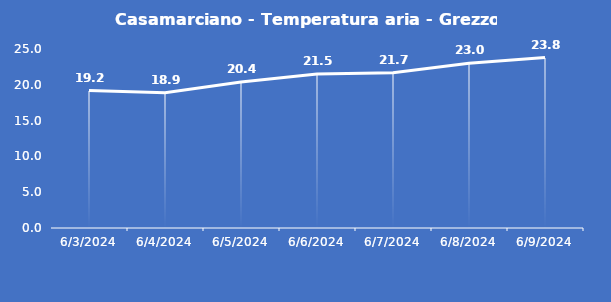
| Category | Casamarciano - Temperatura aria - Grezzo (°C) |
|---|---|
| 6/3/24 | 19.2 |
| 6/4/24 | 18.9 |
| 6/5/24 | 20.4 |
| 6/6/24 | 21.5 |
| 6/7/24 | 21.7 |
| 6/8/24 | 23 |
| 6/9/24 | 23.8 |